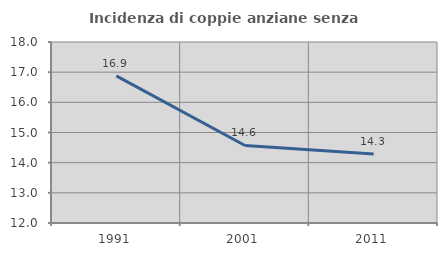
| Category | Incidenza di coppie anziane senza figli  |
|---|---|
| 1991.0 | 16.875 |
| 2001.0 | 14.57 |
| 2011.0 | 14.286 |